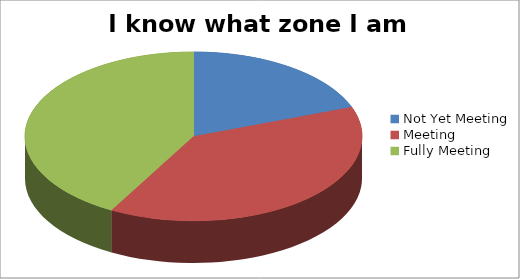
| Category | I know what zone I am in |
|---|---|
| Not Yet Meeting | 6 |
| Meeting | 12 |
| Fully Meeting | 13 |